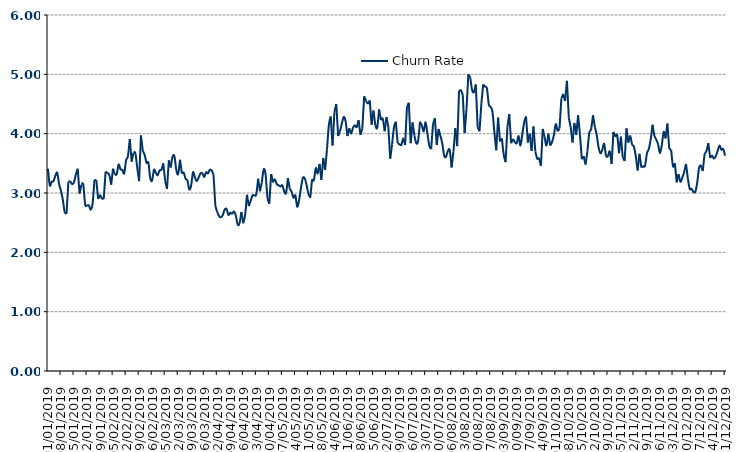
| Category | Churn Rate |
|---|---|
| 01/01/2019 | 3.41 |
| 02/01/2019 | 3.13 |
| 03/01/2019 | 3.19 |
| 04/01/2019 | 3.2 |
| 05/01/2019 | 3.29 |
| 06/01/2019 | 3.34 |
| 07/01/2019 | 3.15 |
| 08/01/2019 | 3.04 |
| 09/01/2019 | 2.89 |
| 10/01/2019 | 2.68 |
| 11/01/2019 | 2.65 |
| 12/01/2019 | 3.19 |
| 13/01/2019 | 3.2 |
| 14/01/2019 | 3.15 |
| 15/01/2019 | 3.18 |
| 16/01/2019 | 3.31 |
| 17/01/2019 | 3.41 |
| 18/01/2019 | 2.99 |
| 19/01/2019 | 3.14 |
| 20/01/2019 | 3.14 |
| 21/01/2019 | 2.81 |
| 22/01/2019 | 2.79 |
| 23/01/2019 | 2.79 |
| 24/01/2019 | 2.72 |
| 25/01/2019 | 2.82 |
| 26/01/2019 | 3.22 |
| 27/01/2019 | 3.22 |
| 28/01/2019 | 2.9 |
| 29/01/2019 | 2.97 |
| 30/01/2019 | 2.91 |
| 31/01/2019 | 2.9 |
| 01/02/2019 | 3.36 |
| 02/02/2019 | 3.34 |
| 03/02/2019 | 3.3 |
| 04/02/2019 | 3.14 |
| 05/02/2019 | 3.41 |
| 06/02/2019 | 3.31 |
| 07/02/2019 | 3.32 |
| 08/02/2019 | 3.48 |
| 09/02/2019 | 3.4 |
| 10/02/2019 | 3.39 |
| 11/02/2019 | 3.33 |
| 12/02/2019 | 3.55 |
| 13/02/2019 | 3.62 |
| 14/02/2019 | 3.91 |
| 15/02/2019 | 3.53 |
| 16/02/2019 | 3.68 |
| 17/02/2019 | 3.67 |
| 18/02/2019 | 3.43 |
| 19/02/2019 | 3.2 |
| 20/02/2019 | 3.97 |
| 21/02/2019 | 3.71 |
| 22/02/2019 | 3.64 |
| 23/02/2019 | 3.51 |
| 24/02/2019 | 3.51 |
| 25/02/2019 | 3.25 |
| 26/02/2019 | 3.21 |
| 27/02/2019 | 3.39 |
| 28/02/2019 | 3.34 |
| 01/03/2019 | 3.3 |
| 02/03/2019 | 3.38 |
| 03/03/2019 | 3.39 |
| 04/03/2019 | 3.5 |
| 05/03/2019 | 3.21 |
| 06/03/2019 | 3.07 |
| 07/03/2019 | 3.55 |
| 08/03/2019 | 3.43 |
| 09/03/2019 | 3.61 |
| 10/03/2019 | 3.62 |
| 11/03/2019 | 3.39 |
| 12/03/2019 | 3.32 |
| 13/03/2019 | 3.56 |
| 14/03/2019 | 3.33 |
| 15/03/2019 | 3.34 |
| 16/03/2019 | 3.24 |
| 17/03/2019 | 3.21 |
| 18/03/2019 | 3.06 |
| 19/03/2019 | 3.13 |
| 20/03/2019 | 3.35 |
| 21/03/2019 | 3.26 |
| 22/03/2019 | 3.2 |
| 23/03/2019 | 3.26 |
| 24/03/2019 | 3.33 |
| 25/03/2019 | 3.33 |
| 26/03/2019 | 3.27 |
| 27/03/2019 | 3.35 |
| 28/03/2019 | 3.33 |
| 29/03/2019 | 3.39 |
| 30/03/2019 | 3.38 |
| 31/03/2019 | 3.31 |
| 01/04/2019 | 2.78 |
| 02/04/2019 | 2.68 |
| 03/04/2019 | 2.61 |
| 04/04/2019 | 2.59 |
| 05/04/2019 | 2.63 |
| 06/04/2019 | 2.72 |
| 07/04/2019 | 2.73 |
| 08/04/2019 | 2.63 |
| 09/04/2019 | 2.67 |
| 10/04/2019 | 2.65 |
| 11/04/2019 | 2.69 |
| 12/04/2019 | 2.62 |
| 13/04/2019 | 2.47 |
| 14/04/2019 | 2.49 |
| 15/04/2019 | 2.68 |
| 16/04/2019 | 2.49 |
| 17/04/2019 | 2.63 |
| 18/04/2019 | 2.97 |
| 19/04/2019 | 2.78 |
| 20/04/2019 | 2.87 |
| 21/04/2019 | 2.96 |
| 22/04/2019 | 2.96 |
| 23/04/2019 | 2.98 |
| 24/04/2019 | 3.24 |
| 25/04/2019 | 3.03 |
| 26/04/2019 | 3.18 |
| 27/04/2019 | 3.4 |
| 28/04/2019 | 3.31 |
| 29/04/2019 | 2.93 |
| 30/04/2019 | 2.82 |
| 01/05/2019 | 3.32 |
| 02/05/2019 | 3.18 |
| 03/05/2019 | 3.23 |
| 04/05/2019 | 3.15 |
| 05/05/2019 | 3.13 |
| 06/05/2019 | 3.11 |
| 07/05/2019 | 3.13 |
| 08/05/2019 | 3.03 |
| 09/05/2019 | 3 |
| 10/05/2019 | 3.25 |
| 11/05/2019 | 3.07 |
| 12/05/2019 | 3.02 |
| 13/05/2019 | 2.92 |
| 14/05/2019 | 2.96 |
| 15/05/2019 | 2.77 |
| 16/05/2019 | 2.88 |
| 17/05/2019 | 3.08 |
| 18/05/2019 | 3.25 |
| 19/05/2019 | 3.25 |
| 20/05/2019 | 3.14 |
| 21/05/2019 | 2.99 |
| 22/05/2019 | 2.92 |
| 23/05/2019 | 3.23 |
| 24/05/2019 | 3.22 |
| 25/05/2019 | 3.42 |
| 26/05/2019 | 3.33 |
| 27/05/2019 | 3.49 |
| 28/05/2019 | 3.22 |
| 29/05/2019 | 3.59 |
| 30/05/2019 | 3.39 |
| 31/05/2019 | 3.73 |
| 01/06/2019 | 4.14 |
| 02/06/2019 | 4.29 |
| 03/06/2019 | 3.8 |
| 04/06/2019 | 4.36 |
| 05/06/2019 | 4.5 |
| 06/06/2019 | 3.96 |
| 07/06/2019 | 4.04 |
| 08/06/2019 | 4.17 |
| 09/06/2019 | 4.28 |
| 10/06/2019 | 4.21 |
| 11/06/2019 | 3.96 |
| 12/06/2019 | 4.09 |
| 13/06/2019 | 4 |
| 14/06/2019 | 4.1 |
| 15/06/2019 | 4.14 |
| 16/06/2019 | 4.11 |
| 17/06/2019 | 4.23 |
| 18/06/2019 | 3.98 |
| 19/06/2019 | 4.09 |
| 20/06/2019 | 4.63 |
| 21/06/2019 | 4.55 |
| 22/06/2019 | 4.51 |
| 23/06/2019 | 4.56 |
| 24/06/2019 | 4.15 |
| 25/06/2019 | 4.39 |
| 26/06/2019 | 4.14 |
| 27/06/2019 | 4.1 |
| 28/06/2019 | 4.41 |
| 29/06/2019 | 4.23 |
| 30/06/2019 | 4.25 |
| 01/07/2019 | 4.04 |
| 02/07/2019 | 4.28 |
| 03/07/2019 | 4.11 |
| 04/07/2019 | 3.58 |
| 05/07/2019 | 3.82 |
| 06/07/2019 | 4.1 |
| 07/07/2019 | 4.2 |
| 08/07/2019 | 3.84 |
| 09/07/2019 | 3.82 |
| 10/07/2019 | 3.81 |
| 11/07/2019 | 3.92 |
| 12/07/2019 | 3.81 |
| 13/07/2019 | 4.45 |
| 14/07/2019 | 4.52 |
| 15/07/2019 | 3.84 |
| 16/07/2019 | 4.19 |
| 17/07/2019 | 3.97 |
| 18/07/2019 | 3.84 |
| 19/07/2019 | 3.88 |
| 20/07/2019 | 4.2 |
| 21/07/2019 | 4.14 |
| 22/07/2019 | 4.04 |
| 23/07/2019 | 4.19 |
| 24/07/2019 | 4 |
| 25/07/2019 | 3.8 |
| 26/07/2019 | 3.74 |
| 27/07/2019 | 4.16 |
| 28/07/2019 | 4.26 |
| 29/07/2019 | 3.81 |
| 30/07/2019 | 4.08 |
| 31/07/2019 | 3.96 |
| 01/08/2019 | 3.83 |
| 02/08/2019 | 3.63 |
| 03/08/2019 | 3.61 |
| 04/08/2019 | 3.71 |
| 05/08/2019 | 3.72 |
| 06/08/2019 | 3.43 |
| 07/08/2019 | 3.7 |
| 08/08/2019 | 4.09 |
| 09/08/2019 | 3.79 |
| 10/08/2019 | 4.72 |
| 11/08/2019 | 4.74 |
| 12/08/2019 | 4.65 |
| 13/08/2019 | 4.01 |
| 14/08/2019 | 4.41 |
| 15/08/2019 | 5 |
| 16/08/2019 | 4.95 |
| 17/08/2019 | 4.74 |
| 18/08/2019 | 4.7 |
| 19/08/2019 | 4.83 |
| 20/08/2019 | 4.11 |
| 21/08/2019 | 4.04 |
| 22/08/2019 | 4.51 |
| 23/08/2019 | 4.83 |
| 24/08/2019 | 4.79 |
| 25/08/2019 | 4.76 |
| 26/08/2019 | 4.49 |
| 27/08/2019 | 4.45 |
| 28/08/2019 | 4.36 |
| 29/08/2019 | 4.02 |
| 30/08/2019 | 3.72 |
| 31/08/2019 | 4.27 |
| 01/09/2019 | 3.87 |
| 02/09/2019 | 3.92 |
| 03/09/2019 | 3.65 |
| 04/09/2019 | 3.52 |
| 05/09/2019 | 4.11 |
| 06/09/2019 | 4.33 |
| 07/09/2019 | 3.84 |
| 08/09/2019 | 3.91 |
| 09/09/2019 | 3.86 |
| 10/09/2019 | 3.84 |
| 11/09/2019 | 3.96 |
| 12/09/2019 | 3.8 |
| 13/09/2019 | 3.99 |
| 14/09/2019 | 4.19 |
| 15/09/2019 | 4.29 |
| 16/09/2019 | 3.85 |
| 17/09/2019 | 4 |
| 18/09/2019 | 3.71 |
| 19/09/2019 | 4.12 |
| 20/09/2019 | 3.7 |
| 21/09/2019 | 3.58 |
| 22/09/2019 | 3.58 |
| 23/09/2019 | 3.46 |
| 24/09/2019 | 4.08 |
| 25/09/2019 | 3.94 |
| 26/09/2019 | 3.8 |
| 27/09/2019 | 4 |
| 28/09/2019 | 3.8 |
| 29/09/2019 | 3.86 |
| 30/09/2019 | 3.98 |
| 01/10/2019 | 4.16 |
| 02/10/2019 | 4.05 |
| 03/10/2019 | 4.09 |
| 04/10/2019 | 4.59 |
| 05/10/2019 | 4.67 |
| 06/10/2019 | 4.55 |
| 07/10/2019 | 4.89 |
| 08/10/2019 | 4.27 |
| 09/10/2019 | 4.11 |
| 10/10/2019 | 3.85 |
| 11/10/2019 | 4.18 |
| 12/10/2019 | 3.98 |
| 13/10/2019 | 4.31 |
| 14/10/2019 | 3.98 |
| 15/10/2019 | 3.57 |
| 16/10/2019 | 3.62 |
| 17/10/2019 | 3.48 |
| 18/10/2019 | 3.7 |
| 19/10/2019 | 4.01 |
| 20/10/2019 | 4.08 |
| 21/10/2019 | 4.31 |
| 22/10/2019 | 4.11 |
| 23/10/2019 | 3.98 |
| 24/10/2019 | 3.77 |
| 25/10/2019 | 3.67 |
| 26/10/2019 | 3.73 |
| 27/10/2019 | 3.83 |
| 28/10/2019 | 3.63 |
| 29/10/2019 | 3.62 |
| 30/10/2019 | 3.7 |
| 31/10/2019 | 3.49 |
| 01/11/2019 | 4.03 |
| 02/11/2019 | 3.95 |
| 03/11/2019 | 3.97 |
| 04/11/2019 | 3.67 |
| 05/11/2019 | 3.95 |
| 06/11/2019 | 3.6 |
| 07/11/2019 | 3.54 |
| 08/11/2019 | 4.09 |
| 09/11/2019 | 3.85 |
| 10/11/2019 | 3.96 |
| 11/11/2019 | 3.82 |
| 12/11/2019 | 3.78 |
| 13/11/2019 | 3.62 |
| 14/11/2019 | 3.38 |
| 15/11/2019 | 3.66 |
| 16/11/2019 | 3.43 |
| 17/11/2019 | 3.45 |
| 18/11/2019 | 3.46 |
| 19/11/2019 | 3.67 |
| 20/11/2019 | 3.74 |
| 21/11/2019 | 3.9 |
| 22/11/2019 | 4.15 |
| 23/11/2019 | 3.96 |
| 24/11/2019 | 3.9 |
| 25/11/2019 | 3.82 |
| 26/11/2019 | 3.67 |
| 27/11/2019 | 3.81 |
| 28/11/2019 | 4.03 |
| 29/11/2019 | 3.92 |
| 30/11/2019 | 4.17 |
| 01/12/2019 | 3.74 |
| 02/12/2019 | 3.73 |
| 03/12/2019 | 3.45 |
| 04/12/2019 | 3.5 |
| 05/12/2019 | 3.18 |
| 06/12/2019 | 3.32 |
| 07/12/2019 | 3.19 |
| 08/12/2019 | 3.26 |
| 09/12/2019 | 3.35 |
| 10/12/2019 | 3.49 |
| 11/12/2019 | 3.24 |
| 12/12/2019 | 3.07 |
| 13/12/2019 | 3.07 |
| 14/12/2019 | 3.02 |
| 15/12/2019 | 3.02 |
| 16/12/2019 | 3.17 |
| 17/12/2019 | 3.42 |
| 18/12/2019 | 3.46 |
| 19/12/2019 | 3.37 |
| 20/12/2019 | 3.66 |
| 21/12/2019 | 3.71 |
| 22/12/2019 | 3.84 |
| 23/12/2019 | 3.59 |
| 24/12/2019 | 3.63 |
| 25/12/2019 | 3.58 |
| 26/12/2019 | 3.62 |
| 27/12/2019 | 3.71 |
| 28/12/2019 | 3.8 |
| 29/12/2019 | 3.73 |
| 30/12/2019 | 3.74 |
| 31/12/2019 | 3.63 |